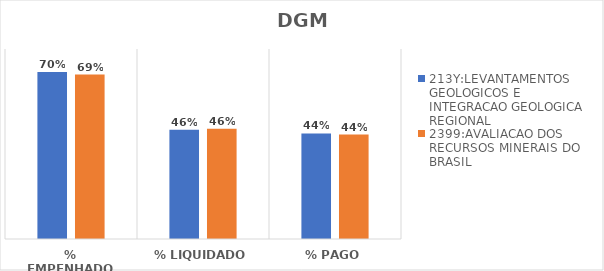
| Category | 213Y:LEVANTAMENTOS GEOLOGICOS E INTEGRACAO GEOLOGICA REGIONAL | 2399:AVALIACAO DOS RECURSOS MINERAIS DO BRASIL |
|---|---|---|
| % EMPENHADO | 0.703 | 0.692 |
| % LIQUIDADO | 0.461 | 0.464 |
| % PAGO | 0.445 | 0.44 |